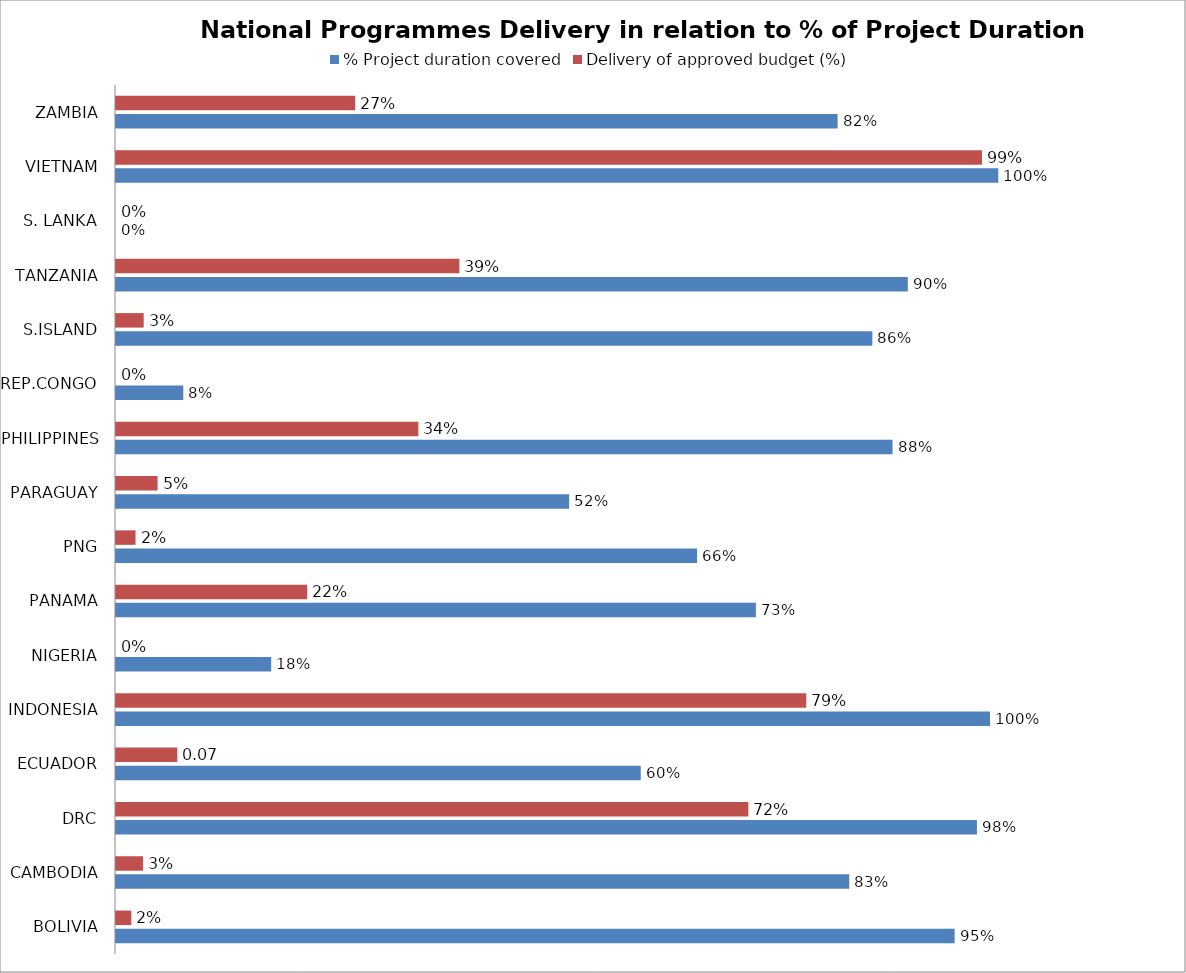
| Category | % Project duration covered | Delivery of approved budget (%) |
|---|---|---|
| BOLIVIA | 0.955 | 0.017 |
| CAMBODIA | 0.835 | 0.031 |
| DRC | 0.98 | 0.72 |
| ECUADOR | 0.597 | 0.07 |
| INDONESIA | 0.995 | 0.786 |
| NIGERIA | 0.177 | 0 |
| PANAMA | 0.729 | 0.218 |
| PNG | 0.662 | 0.022 |
| PARAGUAY | 0.516 | 0.047 |
| PHILIPPINES | 0.884 | 0.344 |
| REP.CONGO | 0.077 | 0 |
| S.ISLAND | 0.861 | 0.032 |
| TANZANIA | 0.902 | 0.391 |
| S. LANKA | 0 | 0 |
| VIETNAM | 1.005 | 0.986 |
| ZAMBIA | 0.822 | 0.272 |